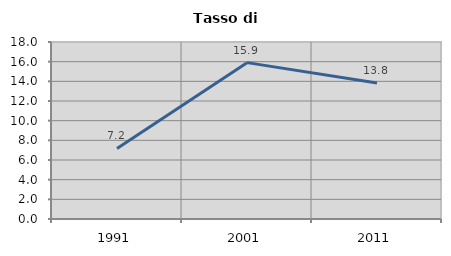
| Category | Tasso di disoccupazione   |
|---|---|
| 1991.0 | 7.17 |
| 2001.0 | 15.902 |
| 2011.0 | 13.835 |